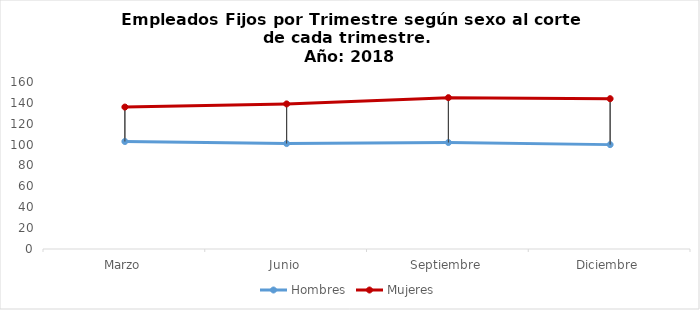
| Category | Hombres | Mujeres |
|---|---|---|
| Marzo | 103 | 136 |
| Junio | 101 | 139 |
| Septiembre | 102 | 145 |
| Diciembre | 100 | 144 |